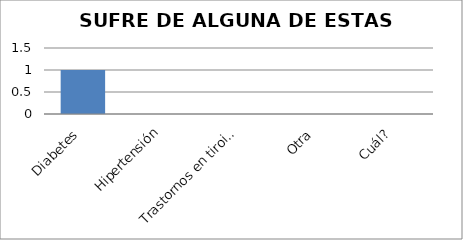
| Category | Series 0 |
|---|---|
| Diabetes | 1 |
| Hipertensión | 0 |
| Trastornos en tiroides | 0 |
| Otra | 0 |
| Cuál? | 0 |